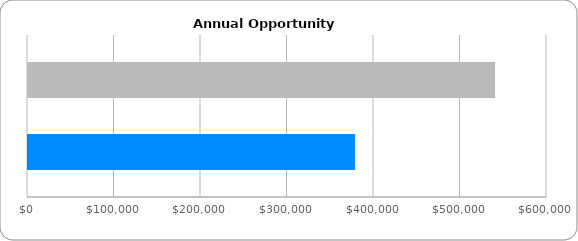
| Category | Series1 | Series2 | Series 2 |
|---|---|---|---|
| 0 | 540000 |  | 378000 |